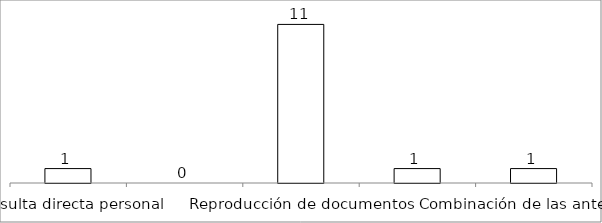
| Category | Series 0 |
|---|---|
| Consulta directa personal | 1 |
| Consulta directa electrónica | 0 |
| Reproducción de documentos | 11 |
| Elaboración de informes | 1 |
| Combinación de las anteriores | 1 |